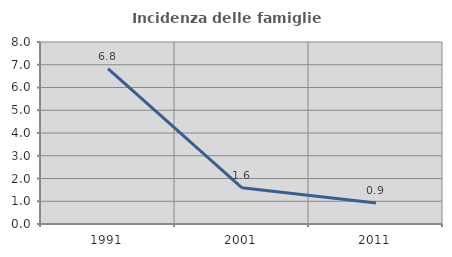
| Category | Incidenza delle famiglie numerose |
|---|---|
| 1991.0 | 6.825 |
| 2001.0 | 1.591 |
| 2011.0 | 0.919 |